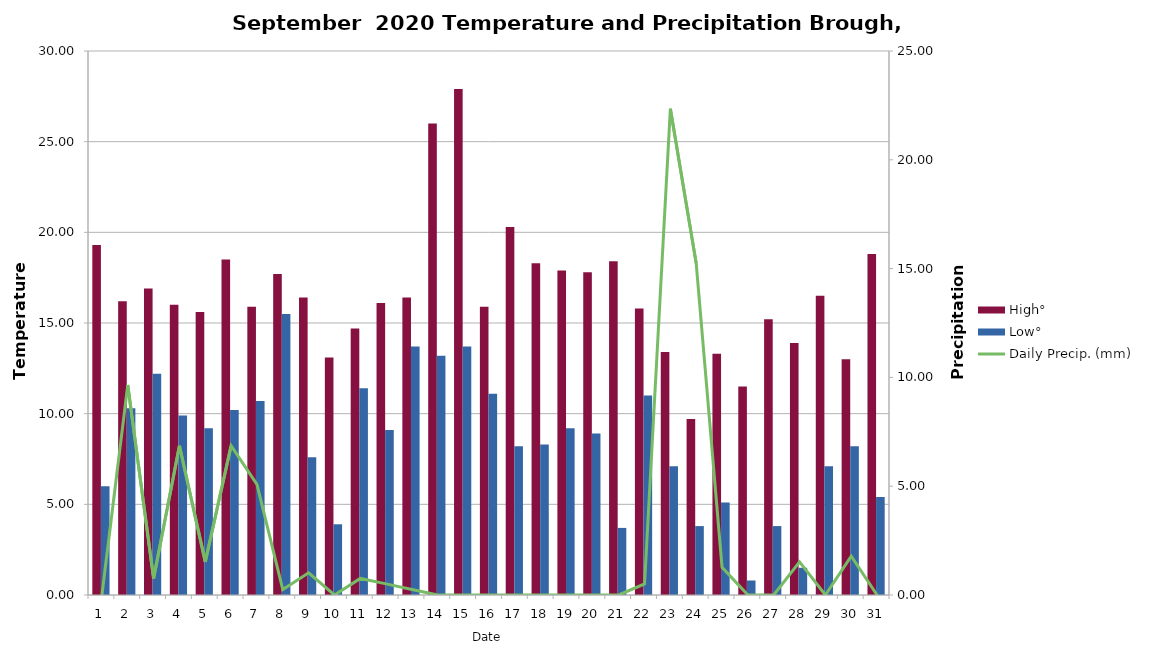
| Category | High° | Low° |
|---|---|---|
| 0 | 19.3 | 6 |
| 1 | 16.2 | 10.3 |
| 2 | 16.9 | 12.2 |
| 3 | 16 | 9.9 |
| 4 | 15.6 | 9.2 |
| 5 | 18.5 | 10.2 |
| 6 | 15.9 | 10.7 |
| 7 | 17.7 | 15.5 |
| 8 | 16.4 | 7.6 |
| 9 | 13.1 | 3.9 |
| 10 | 14.7 | 11.4 |
| 11 | 16.1 | 9.1 |
| 12 | 16.4 | 13.7 |
| 13 | 26 | 13.2 |
| 14 | 27.9 | 13.7 |
| 15 | 15.9 | 11.1 |
| 16 | 20.3 | 8.2 |
| 17 | 18.3 | 8.3 |
| 18 | 17.9 | 9.2 |
| 19 | 17.8 | 8.9 |
| 20 | 18.4 | 3.7 |
| 21 | 15.8 | 11 |
| 22 | 13.4 | 7.1 |
| 23 | 9.7 | 3.8 |
| 24 | 13.3 | 5.1 |
| 25 | 11.5 | 0.8 |
| 26 | 15.2 | 3.8 |
| 27 | 13.9 | 1.5 |
| 28 | 16.5 | 7.1 |
| 29 | 13 | 8.2 |
| 30 | 18.8 | 5.4 |